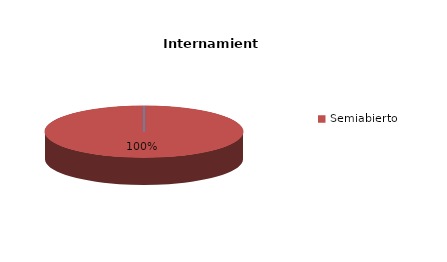
| Category | Series 0 |
|---|---|
| Cerrado | 0 |
| Semiabierto | 3 |
| Abierto | 0 |
| Terapeúticos | 0 |